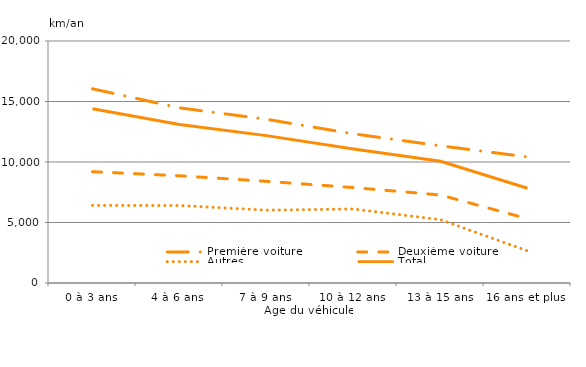
| Category | Première voiture | Deuxième voiture | Autres | Total |
|---|---|---|---|---|
| 0 à 3 ans | 16048.314 | 9198.544 | 6412.586 | 14394.591 |
| 4 à 6 ans | 14475.529 | 8861.442 | 6404.089 | 13098.658 |
| 7 à 9 ans | 13529.905 | 8404.174 | 6019.913 | 12180.487 |
| 10 à 12 ans | 12329.201 | 7886.291 | 6115.472 | 11080.871 |
| 13 à 15 ans | 11337.14 | 7274.098 | 5232.407 | 10059.377 |
| 16 ans et plus | 10419.255 | 5312.427 | 2652.793 | 7832.777 |